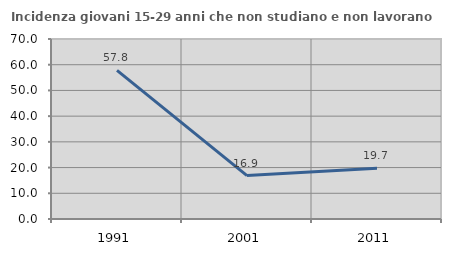
| Category | Incidenza giovani 15-29 anni che non studiano e non lavorano  |
|---|---|
| 1991.0 | 57.812 |
| 2001.0 | 16.883 |
| 2011.0 | 19.708 |